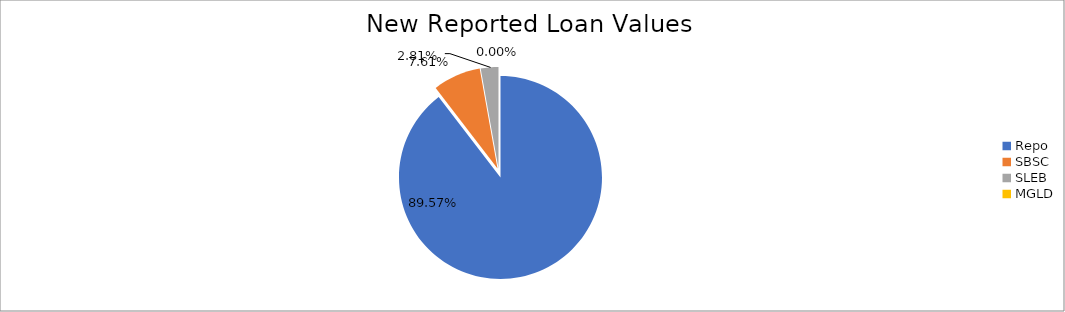
| Category | Series 0 |
|---|---|
| Repo | 11696810.271 |
| SBSC | 994359.876 |
| SLEB | 366949.06 |
| MGLD | 146.434 |